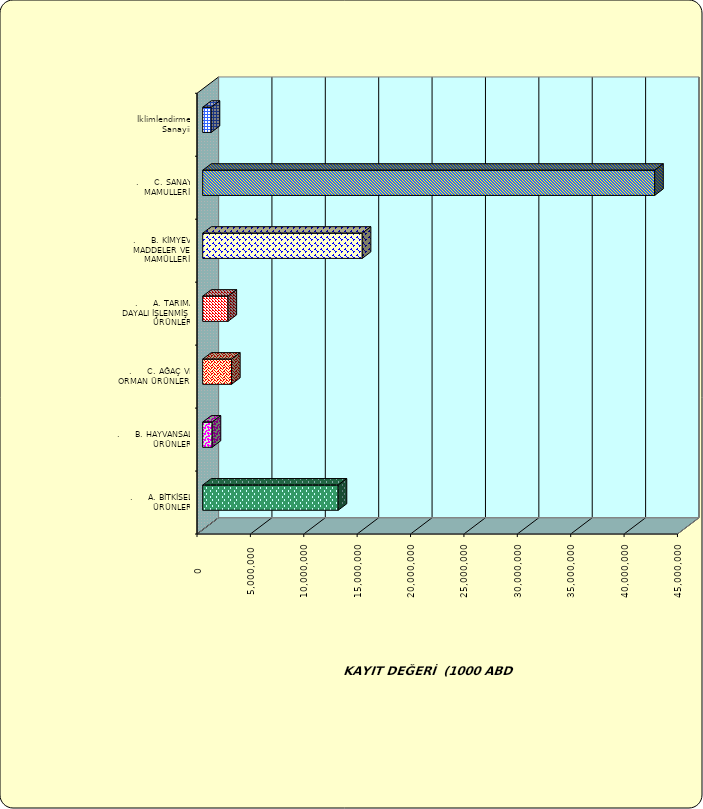
| Category | Series 0 |
|---|---|
| .     A. BİTKİSEL ÜRÜNLER | 12689190.579 |
| .     B. HAYVANSAL ÜRÜNLER | 887008.474 |
| .     C. AĞAÇ VE ORMAN ÜRÜNLERİ | 2702477.414 |
| .     A. TARIMA DAYALI İŞLENMİŞ ÜRÜNLER | 2372604.179 |
| .     B. KİMYEVİ MADDELER VE MAMÜLLERİ | 14944512.975 |
| .     C. SANAYİ MAMULLERİ | 42334381.442 |
|  İklimlendirme Sanayii | 795015.678 |